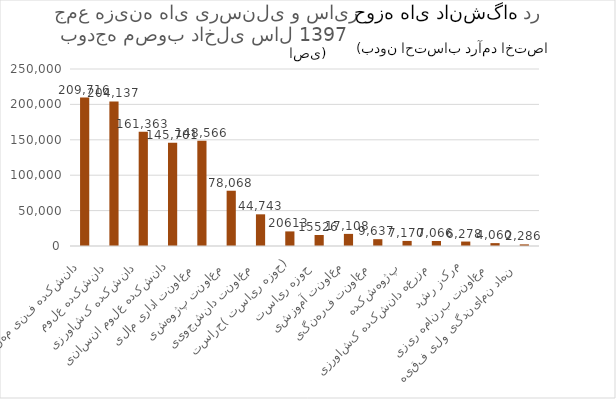
| Category | جمع هزینه ها (یرسنلی و سایر) |
|---|---|
|  دانشکده فنی مهندسی  | 209716 |
|  دانشکده علوم   | 204137 |
|  دانشکده کشاورزی   | 161363 |
|  دانشکده علوم انسانی  | 145701 |
|  معاونت اداری مالی   | 148566 |
|  معاونت پژوهشی   | 78068 |
|  معاونت دانشجویی   | 44743 |
| حوزه ریاست (حراست) | 20613 |
|  حوزه ریاست   | 15526 |
|  معاونت آموزشی  | 17108 |
|  معاونت فرهنگی   | 9637 |
|  پژوهشکده   | 7170 |
|  مزرعه دانشکده کشاورزی   | 7066.4 |
|  مرکز رشد  | 6278 |
|  معاونت برنامه ریزی   | 4060 |
|  نهاد نمایندگی ولی فقیه   | 2286 |